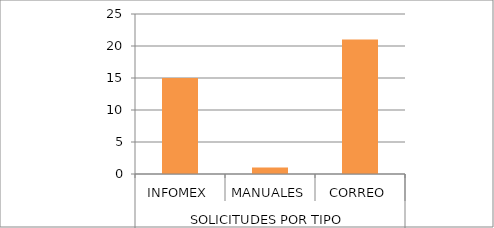
| Category | Series 0 |
|---|---|
| 0 | 15 |
| 1 | 1 |
| 2 | 21 |